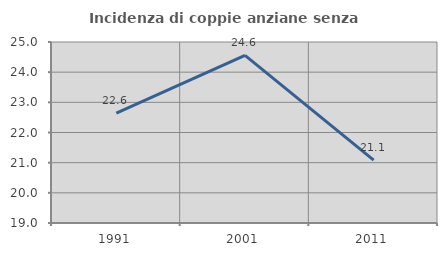
| Category | Incidenza di coppie anziane senza figli  |
|---|---|
| 1991.0 | 22.642 |
| 2001.0 | 24.558 |
| 2011.0 | 21.087 |